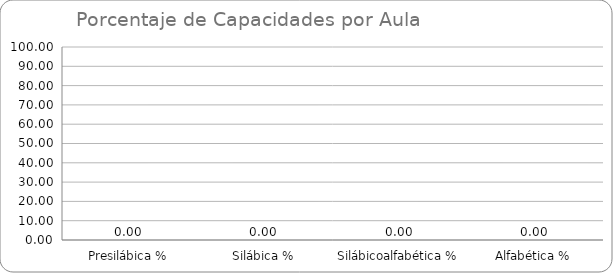
| Category | Series 0 |
|---|---|
| Presilábica % | 0 |
| Silábica % | 0 |
| Silábicoalfabética % | 0 |
| Alfabética % | 0 |